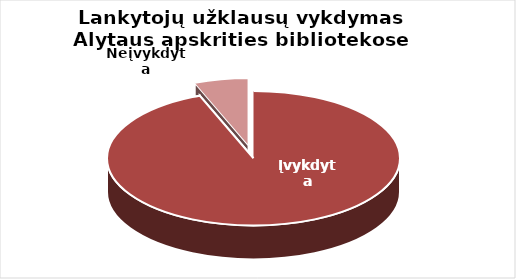
| Category | Series 0 |
|---|---|
| Įvykdyta | 30895 |
| Neįvykdyta | 1968 |